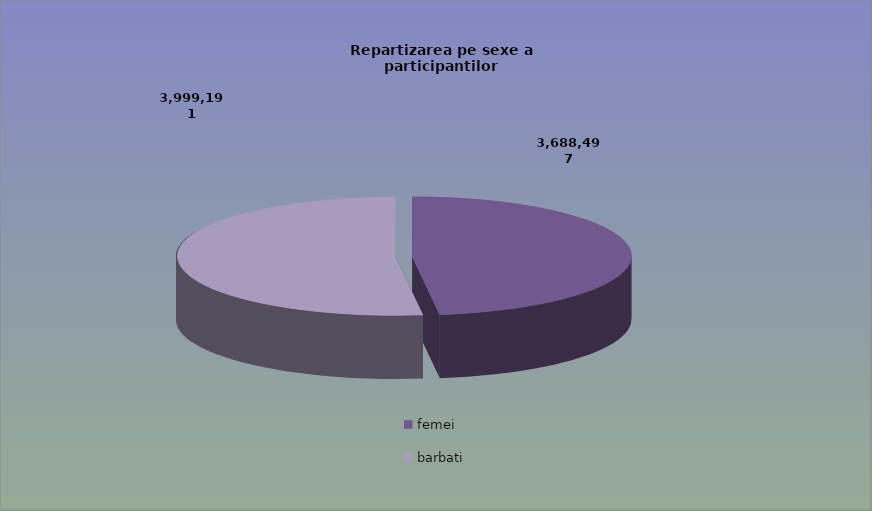
| Category | Series 0 |
|---|---|
| femei | 3688497 |
| barbati | 3999191 |